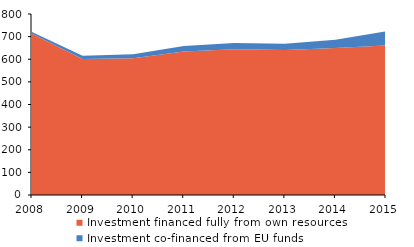
| Category | Investment financed fully from own resources | Investment co-financed from EU funds |
|---|---|---|
| 2008.0 | 713.082 | 7.52 |
| 2009.0 | 600.986 | 14.514 |
| 2010.0 | 604.939 | 16.818 |
| 2011.0 | 634.552 | 23.495 |
| 2012.0 | 643.687 | 28.407 |
| 2013.0 | 640.92 | 27.631 |
| 2014.0 | 649.416 | 36.556 |
| 2015.0 | 660.732 | 62.496 |